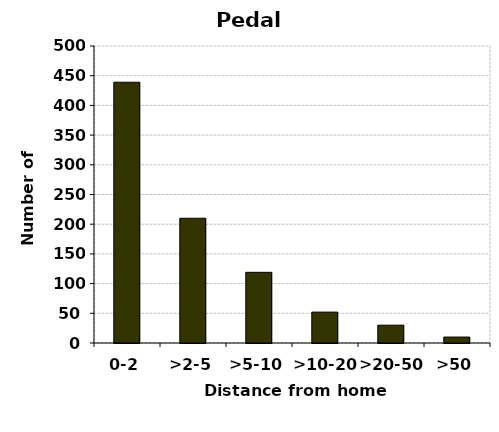
| Category | Pedal cycles |
|---|---|
| 0-2 | 439 |
| >2-5 | 210 |
| >5-10 | 119 |
| >10-20 | 52 |
| >20-50 | 30 |
| >50 | 10 |